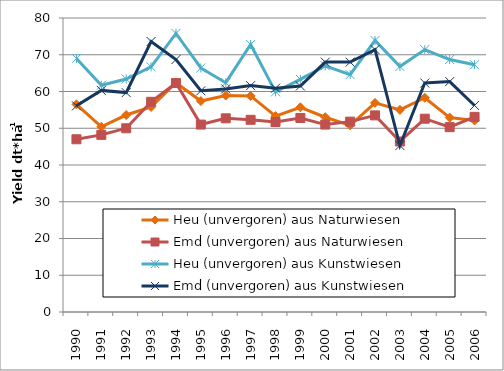
| Category | Heu (unvergoren) aus Naturwiesen | Emd (unvergoren) aus Naturwiesen | Heu (unvergoren) aus Kunstwiesen | Emd (unvergoren) aus Kunstwiesen |
|---|---|---|---|---|
| 1990.0 | 56.5 | 47 | 69 | 56.1 |
| 1991.0 | 50.4 | 48.2 | 61.7 | 60.3 |
| 1992.0 | 53.6 | 50 | 63.4 | 59.7 |
| 1993.0 | 55.8 | 57.2 | 66.7 | 73.6 |
| 1994.0 | 62.4 | 62.3 | 75.8 | 68.7 |
| 1995.0 | 57.4 | 51 | 66.4 | 60.2 |
| 1996.0 | 58.9 | 52.7 | 62.4 | 60.7 |
| 1997.0 | 58.8 | 52.3 | 72.8 | 61.6 |
| 1998.0 | 53.3 | 51.7 | 59.9 | 60.9 |
| 1999.0 | 55.7 | 52.8 | 63.3 | 61.5 |
| 2000.0 | 53 | 51 | 67 | 68 |
| 2001.0 | 50.8 | 51.8 | 64.6 | 68 |
| 2002.0 | 56.9 | 53.5 | 73.9 | 71.4 |
| 2003.0 | 55 | 46.4 | 66.8 | 45.3 |
| 2004.0 | 58.3 | 52.6 | 71.4 | 62.3 |
| 2005.0 | 52.9 | 50.3 | 68.7 | 62.7 |
| 2006.0 | 52.1 | 53.1 | 67.3 | 56.2 |